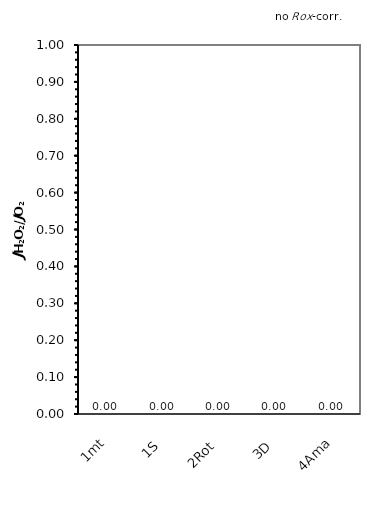
| Category | H2O2 flux per x/O2 flux per x |
|---|---|
| 1mt | 0 |
| 1S | 0 |
| 2Rot | 0 |
| 3D | 0 |
| 4Ama | 0 |